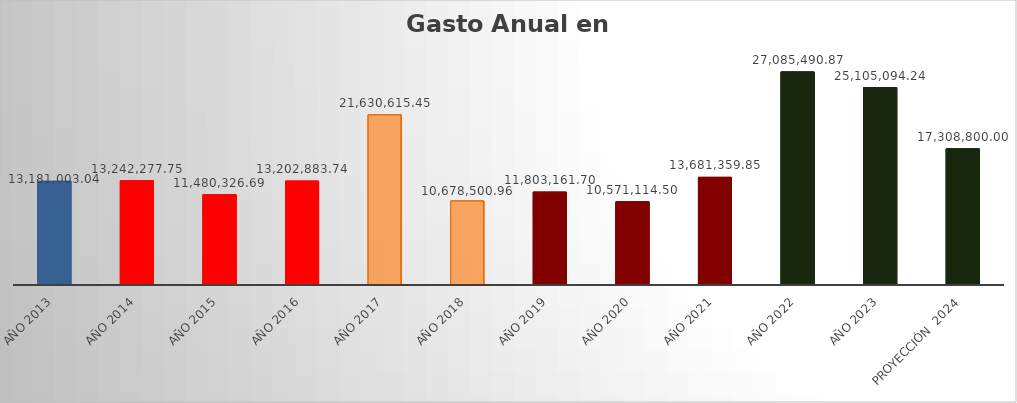
| Category | Monto |
|---|---|
| Año 2013 | 13181003.04 |
| Año 2014 | 13242277.75 |
| Año 2015 | 11480326.69 |
| Año 2016 | 13202883.74 |
| Año 2017 | 21630615.45 |
| Año 2018 | 10678500.96 |
| Año 2019 | 11803161.7 |
| Año 2020 | 10571114.5 |
| Año 2021 | 13681359.85 |
| Año 2022 | 27085490.87 |
| Año 2023 | 25105094.24 |
| Proyección  2024 | 17308800 |